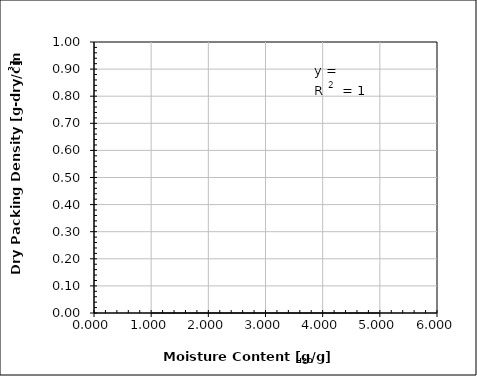
| Category | Pre-Test Data |
|---|---|
| 0 | 0 |
| 1 | 0 |
| 2 | 0 |
| 3 | 0 |
| 4 | 0 |